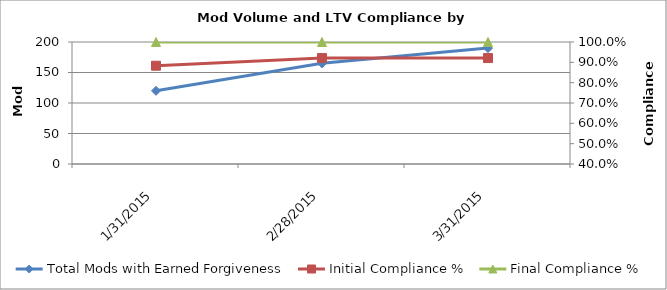
| Category | Total Mods with Earned Forgiveness |
|---|---|
| 1/31/15 | 120 |
| 2/28/15 | 165 |
| 3/31/15 | 190 |